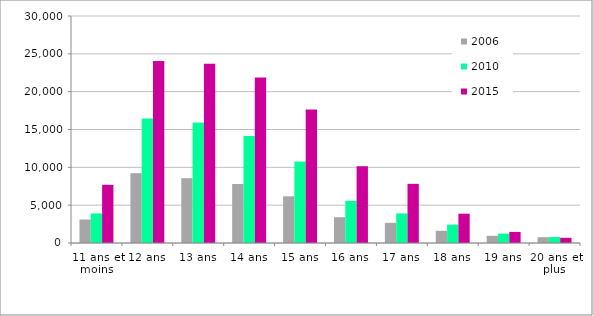
| Category | 2006 | 2010 | 2015 |
|---|---|---|---|
| 11 ans et moins | 3106 | 3909 | 7693 |
| 12 ans | 9226 | 16438 | 24045 |
| 13 ans | 8571 | 15924 | 23705 |
| 14 ans | 7796 | 14130 | 21862 |
| 15 ans | 6172 | 10762 | 17636 |
| 16 ans | 3413 | 5576 | 10145 |
| 17 ans | 2665 | 3909 | 7820 |
| 18 ans | 1615 | 2423 | 3871 |
| 19 ans | 949 | 1236 | 1468 |
| 20 ans et plus | 765 | 787 | 690 |